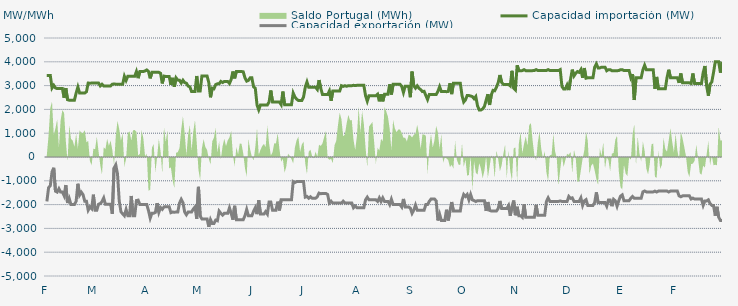
| Category | Capacidad importación (MW) | Capacidad exportación (MW) |
|---|---|---|
| 0 | 3425 | -1866.667 |
| 1900-01-01 | 3425 | -1287.5 |
| 1900-01-02 | 3425 | -1206.25 |
| 1900-01-03 | 2900 | -625 |
| 1900-01-04 | 3012.5 | -454.167 |
| 1900-01-05 | 2900 | -1437.5 |
| 1900-01-06 | 2875 | -1475 |
| 1900-01-07 | 2875 | -1333.333 |
| 1900-01-08 | 2875 | -1475 |
| 1900-01-09 | 2875 | -1475 |
| 1900-01-10 | 2491.667 | -1625 |
| 1900-01-11 | 2895.833 | -1179.167 |
| 1900-01-12 | 2408.333 | -1933.333 |
| 1900-01-13 | 2387.5 | -1745.833 |
| 1900-01-14 | 2387.5 | -2000 |
| 1900-01-15 | 2387.5 | -2000 |
| 1900-01-16 | 2387.5 | -2000 |
| 1900-01-17 | 2687.5 | -1858.333 |
| 1900-01-18 | 2939.583 | -1125 |
| 1900-01-19 | 2687.5 | -1600 |
| 1900-01-20 | 2687.5 | -1479.167 |
| 1900-01-21 | 2687.5 | -1579.167 |
| 1900-01-22 | 2687.5 | -1858.333 |
| 1900-01-23 | 2743.75 | -1858.333 |
| 1900-01-24 | 3108.333 | -2233.333 |
| 1900-01-25 | 3100 | -2102.083 |
| 1900-01-26 | 3108.333 | -2175 |
| 1900-01-27 | 3108.333 | -1584 |
| 1900-01-28 | 3108.333 | -2233.333 |
| 1900-01-29 | 3108.333 | -2233.333 |
| 1900-01-30 | 3108.333 | -1985.417 |
| 1900-01-31 | 2987.5 | -1958.333 |
| 1900-02-01 | 3056.25 | -1872.917 |
| 1900-02-02 | 2987.5 | -1720.833 |
| 1900-02-03 | 2987.5 | -1987.5 |
| 1900-02-04 | 2987.5 | -1987.5 |
| 1900-02-05 | 2987.5 | -1987.5 |
| 1900-02-06 | 2987.5 | -1987.5 |
| 1900-02-07 | 3058.333 | -2387.5 |
| 1900-02-08 | 3070.833 | -464.583 |
| 1900-02-09 | 3058.333 | -331.25 |
| 1900-02-10 | 3058.333 | -706.25 |
| 1900-02-11 | 3058.333 | -1839.583 |
| 1900-02-12 | 3058.333 | -2300 |
| 1900-02-13 | 3058.333 | -2387.5 |
| 1900-02-14 | 3391.667 | -2466.667 |
| 1900-02-15 | 3216.667 | -2204.167 |
| 1900-02-16 | 3391.667 | -2466.667 |
| 1900-02-17 | 3391.667 | -2466.667 |
| 1900-02-18 | 3391.667 | -1637.5 |
| 1900-02-19 | 3391.667 | -2466.667 |
| 1900-02-20 | 3391.667 | -2466.667 |
| 1900-02-21 | 3591.667 | -1829.167 |
| 1900-02-22 | 3313.043 | -1813.043 |
| 1900-02-23 | 3591.667 | -2000 |
| 1900-02-24 | 3591.667 | -2000 |
| 1900-02-25 | 3591.667 | -2000 |
| 1900-02-26 | 3616.667 | -2000 |
| 1900-02-27 | 3658.333 | -2000 |
| 1900-02-28 | 3591.667 | -2252.083 |
| 1900-02-28 | 3304.167 | -2568.75 |
| 1900-03-01 | 3560.417 | -2362.5 |
| 1900-03-02 | 3558.333 | -2362.5 |
| 1900-03-03 | 3558.333 | -2325 |
| 1900-03-04 | 3558.333 | -1937.5 |
| 1900-03-05 | 3558.333 | -2325 |
| 1900-03-06 | 3516.667 | -2125 |
| 1900-03-07 | 3091.667 | -2200 |
| 1900-03-08 | 3400 | -2095.833 |
| 1900-03-09 | 3383.333 | -2087.5 |
| 1900-03-10 | 3383.333 | -2087.5 |
| 1900-03-11 | 3383.333 | -2087.5 |
| 1900-03-12 | 3033.333 | -2339.583 |
| 1900-03-13 | 3325 | -2312.5 |
| 1900-03-14 | 2947.917 | -2320.833 |
| 1900-03-15 | 3325 | -2312.5 |
| 1900-03-16 | 3231.25 | -2312.5 |
| 1900-03-17 | 3225 | -1935.417 |
| 1900-03-18 | 3108.333 | -1779.167 |
| 1900-03-19 | 3225 | -1916.667 |
| 1900-03-20 | 3125 | -2312.5 |
| 1900-03-21 | 3100 | -2427.083 |
| 1900-03-22 | 2979.167 | -2312.5 |
| 1900-03-23 | 2950 | -2312.5 |
| 1900-03-24 | 2750 | -2312.5 |
| 1900-03-25 | 2750 | -2187.5 |
| 1900-03-26 | 2750 | -2100 |
| 1900-03-27 | 3404.167 | -2600 |
| 1900-03-28 | 2772.917 | -1254.167 |
| 1900-03-29 | 2772.917 | -2487.5 |
| 1900-03-30 | 3404.167 | -2600 |
| 1900-03-31 | 3404.167 | -2600 |
| 1900-04-01 | 3404.167 | -2600 |
| 1900-04-02 | 3404.167 | -2600 |
| 1900-04-03 | 3133.333 | -2933.333 |
| 1900-04-04 | 2508.333 | -2633.333 |
| 1900-04-05 | 2891.667 | -2791.667 |
| 1900-04-06 | 2866.667 | -2791.667 |
| 1900-04-07 | 3043.75 | -2652.083 |
| 1900-04-08 | 3075 | -2679.167 |
| 1900-04-09 | 3075 | -2272.917 |
| 1900-04-10 | 3175 | -2366.667 |
| 1900-04-11 | 3129.167 | -2441.667 |
| 1900-04-12 | 3175 | -2366.667 |
| 1900-04-13 | 3175 | -2366.667 |
| 1900-04-14 | 3175 | -2366.667 |
| 1900-04-15 | 3087.5 | -2135.417 |
| 1900-04-16 | 3258.333 | -2366.667 |
| 1900-04-17 | 3591.667 | -2633.333 |
| 1900-04-18 | 3304.167 | -2050 |
| 1900-04-19 | 3591.667 | -2633.333 |
| 1900-04-20 | 3591.667 | -2633.333 |
| 1900-04-21 | 3591.667 | -2633.333 |
| 1900-04-22 | 3591.667 | -2633.333 |
| 1900-04-23 | 3579.167 | -2633.333 |
| 1900-04-24 | 3325 | -2466.667 |
| 1900-04-25 | 3187.5 | -2204.167 |
| 1900-04-26 | 3220.833 | -2466.667 |
| 1900-04-27 | 3325 | -2466.667 |
| 1900-04-28 | 3325 | -2466.667 |
| 1900-04-29 | 2950 | -2279.167 |
| 1900-04-30 | 2887.5 | -2133.333 |
| 1900-05-01 | 2187.5 | -2400 |
| 1900-05-02 | 1981.25 | -1816.667 |
| 1900-05-03 | 2187.5 | -2400 |
| 1900-05-04 | 2187.5 | -2400 |
| 1900-05-05 | 2187.5 | -2400 |
| 1900-05-06 | 2187.5 | -2295.833 |
| 1900-05-07 | 2187.5 | -2400 |
| 1900-05-08 | 2312.5 | -1891.667 |
| 1900-05-09 | 2793.75 | -1891.667 |
| 1900-05-10 | 2312.5 | -2235.417 |
| 1900-05-11 | 2312.5 | -2233.333 |
| 1900-05-12 | 2312.5 | -2233.333 |
| 1900-05-13 | 2312.5 | -1877.083 |
| 1900-05-14 | 2312.5 | -2243.75 |
| 1900-05-15 | 2200 | -1800 |
| 1900-05-16 | 2750 | -1800 |
| 1900-05-17 | 2200 | -1800 |
| 1900-05-18 | 2200 | -1800 |
| 1900-05-19 | 2200 | -1800 |
| 1900-05-20 | 2200 | -1800 |
| 1900-05-21 | 2200 | -1800 |
| 1900-05-22 | 2687.5 | -1033.333 |
| 1900-05-23 | 2522.917 | -1070.833 |
| 1900-05-24 | 2429.167 | -1033.333 |
| 1900-05-25 | 2375 | -1033.333 |
| 1900-05-26 | 2375 | -1033.333 |
| 1900-05-27 | 2375 | -1033.333 |
| 1900-05-28 | 2520.833 | -1033.333 |
| 1900-05-29 | 2929.167 | -1685.417 |
| 1900-05-30 | 3154.167 | -1658.333 |
| 1900-05-31 | 2929.167 | -1733.333 |
| 1900-06-01 | 2929.167 | -1670.833 |
| 1900-06-02 | 2929.167 | -1733.333 |
| 1900-06-03 | 2929.167 | -1733.333 |
| 1900-06-04 | 2929.167 | -1733.333 |
| 1900-06-05 | 2837.5 | -1666.667 |
| 1900-06-06 | 3231.25 | -1516.667 |
| 1900-06-07 | 2887.5 | -1541.667 |
| 1900-06-08 | 2625 | -1533.333 |
| 1900-06-09 | 2625 | -1533.333 |
| 1900-06-10 | 2625 | -1533.333 |
| 1900-06-11 | 2625 | -1575 |
| 1900-06-12 | 2775 | -1933.333 |
| 1900-06-13 | 2362.5 | -1858.333 |
| 1900-06-14 | 2775 | -1933.333 |
| 1900-06-15 | 2775 | -1933.333 |
| 1900-06-16 | 2775 | -1933.333 |
| 1900-06-17 | 2775 | -1933.333 |
| 1900-06-18 | 2775 | -1933.333 |
| 1900-06-19 | 2995.833 | -1933.333 |
| 1900-06-20 | 2964.583 | -1858.333 |
| 1900-06-21 | 2995.833 | -1933.333 |
| 1900-06-22 | 2970.833 | -1933.333 |
| 1900-06-23 | 2995.833 | -1933.333 |
| 1900-06-24 | 2995.833 | -1933.333 |
| 1900-06-25 | 2995.833 | -1933.333 |
| 1900-06-26 | 3012.5 | -2133.333 |
| 1900-06-27 | 3000 | -2058.333 |
| 1900-06-28 | 3012.5 | -2133.333 |
| 1900-06-29 | 3012.5 | -2133.333 |
| 1900-06-30 | 3012.5 | -2133.333 |
| 1900-07-01 | 3012.5 | -2133.333 |
| 1900-07-02 | 3012.5 | -2133.333 |
| 1900-07-03 | 2575 | -1800 |
| 1900-07-04 | 2345.833 | -1687.5 |
| 1900-07-05 | 2575 | -1800 |
| 1900-07-06 | 2575 | -1800 |
| 1900-07-07 | 2575 | -1800 |
| 1900-07-08 | 2575 | -1800 |
| 1900-07-09 | 2575 | -1800 |
| 1900-07-10 | 2637.5 | -1866.667 |
| 1900-07-11 | 2339.583 | -1716.667 |
| 1900-07-12 | 2637.5 | -1866.667 |
| 1900-07-13 | 2339.583 | -1716.667 |
| 1900-07-14 | 2637.5 | -1866.667 |
| 1900-07-15 | 2637.5 | -1866.667 |
| 1900-07-16 | 2637.5 | -1866.667 |
| 1900-07-17 | 3054.167 | -2000 |
| 1900-07-18 | 2627.083 | -1775 |
| 1900-07-19 | 3054.167 | -2000 |
| 1900-07-20 | 3054.167 | -2000 |
| 1900-07-21 | 3054.167 | -2000 |
| 1900-07-22 | 3054.167 | -2000 |
| 1900-07-23 | 3054.167 | -2000 |
| 1900-07-24 | 2970.833 | -2100 |
| 1900-07-25 | 2710.417 | -1762.5 |
| 1900-07-26 | 2970.833 | -2100 |
| 1900-07-27 | 2970.833 | -2100 |
| 1900-07-28 | 2970.833 | -2100 |
| 1900-07-29 | 2512.5 | -2150 |
| 1900-07-30 | 3587.5 | -2366.667 |
| 1900-07-31 | 2991.667 | -2233.333 |
| 1900-08-01 | 2893.75 | -2020.833 |
| 1900-08-02 | 2991.667 | -2233.333 |
| 1900-08-03 | 2891.667 | -2233.333 |
| 1900-08-04 | 2827.083 | -2233.333 |
| 1900-08-05 | 2750 | -2233.333 |
| 1900-08-06 | 2760.417 | -2233.333 |
| 1900-08-07 | 2583.333 | -2000 |
| 1900-08-08 | 2414.583 | -2000 |
| 1900-08-09 | 2629.167 | -1862.5 |
| 1900-08-10 | 2625 | -1766.667 |
| 1900-08-11 | 2625 | -1766.667 |
| 1900-08-12 | 2625 | -1766.667 |
| 1900-08-13 | 2625 | -1841.667 |
| 1900-08-14 | 2754.167 | -2666.667 |
| 1900-08-15 | 2954.167 | -2404.167 |
| 1900-08-16 | 2754.167 | -2666.667 |
| 1900-08-17 | 2754.167 | -2666.667 |
| 1900-08-18 | 2754.167 | -2666.667 |
| 1900-08-19 | 2743.75 | -2216.667 |
| 1900-08-20 | 2754.167 | -2666.667 |
| 1900-08-21 | 3100 | -2266.667 |
| 1900-08-22 | 2641.667 | -1891.667 |
| 1900-08-23 | 3100 | -2266.667 |
| 1900-08-24 | 3100 | -2266.667 |
| 1900-08-25 | 3100 | -2266.667 |
| 1900-08-26 | 3100 | -2266.667 |
| 1900-08-27 | 3100 | -2266.667 |
| 1900-08-28 | 2583.333 | -1800 |
| 1900-08-29 | 2310.417 | -1575 |
| 1900-08-30 | 2400 | -1658.333 |
| 1900-08-31 | 2583.333 | -1575 |
| 1900-09-01 | 2583.333 | -1800 |
| 1900-09-02 | 2562.5 | -1575 |
| 1900-09-03 | 2537.5 | -1800 |
| 1900-09-04 | 2450 | -1833.333 |
| 1900-09-05 | 2541.667 | -1870.833 |
| 1900-09-06 | 2150 | -1833.333 |
| 1900-09-07 | 1975 | -1833.333 |
| 1900-09-08 | 1975 | -1833.333 |
| 1900-09-09 | 2020.833 | -1833.333 |
| 1900-09-10 | 2125 | -1833.333 |
| 1900-09-11 | 2387.5 | -2266.667 |
| 1900-09-12 | 2639.583 | -1891.667 |
| 1900-09-13 | 2187.5 | -2243.75 |
| 1900-09-14 | 2610.417 | -2266.667 |
| 1900-09-15 | 2800 | -2266.667 |
| 1900-09-16 | 2783.333 | -2266.667 |
| 1900-09-17 | 2931.25 | -2266.667 |
| 1900-09-18 | 3125 | -2166.667 |
| 1900-09-19 | 3445.833 | -1847.917 |
| 1900-09-20 | 3137.5 | -2166.667 |
| 1900-09-21 | 3050 | -2166.667 |
| 1900-09-22 | 3050 | -2166.667 |
| 1900-09-23 | 3050 | -2166.667 |
| 1900-09-24 | 3050 | -2041.667 |
| 1900-09-25 | 2987.5 | -2466.667 |
| 1900-09-26 | 3622 | -2080 |
| 1900-09-27 | 2887.5 | -1829.167 |
| 1900-09-28 | 2816.667 | -2445.833 |
| 1900-09-29 | 3854.167 | -2091.667 |
| 1900-09-30 | 3625 | -2466.667 |
| 1900-10-01 | 3625 | -2466.667 |
| 1900-10-02 | 3629.167 | -2533.333 |
| 1900-10-03 | 3670.833 | -1987.5 |
| 1900-10-04 | 3629.167 | -2533.333 |
| 1900-10-05 | 3629.167 | -2533.333 |
| 1900-10-06 | 3629.167 | -2533.333 |
| 1900-10-07 | 3629.167 | -2533.333 |
| 1900-10-08 | 3629.167 | -2533.333 |
| 1900-10-09 | 3633.333 | -2533.333 |
| 1900-10-10 | 3670.833 | -2008.333 |
| 1900-10-11 | 3633.333 | -2450 |
| 1900-10-12 | 3633.333 | -2450 |
| 1900-10-13 | 3633.333 | -2450 |
| 1900-10-14 | 3633.333 | -2450 |
| 1900-10-15 | 3633.333 | -2450 |
| 1900-10-16 | 3633.333 | -1866.667 |
| 1900-10-17 | 3670.833 | -1716.667 |
| 1900-10-18 | 3633.333 | -1866.667 |
| 1900-10-19 | 3633.333 | -1866.667 |
| 1900-10-20 | 3633.333 | -1866.667 |
| 1900-10-21 | 3633.333 | -1866.667 |
| 1900-10-22 | 3633.333 | -1866.667 |
| 1900-10-23 | 3633.333 | -1866.667 |
| 1900-10-24 | 3670.833 | -1845.833 |
| 1900-10-25 | 2966.667 | -1866.667 |
| 1900-10-26 | 2858.333 | -1866.667 |
| 1900-10-27 | 2858.333 | -1866.667 |
| 1900-10-28 | 3025 | -1866.667 |
| 1900-10-29 | 2812.5 | -1658.333 |
| 1900-10-30 | 3262.5 | -1737.5 |
| 1900-10-31 | 3670.833 | -1716.667 |
| 1900-11-01 | 3404.167 | -1866.667 |
| 1900-11-02 | 3512.5 | -1866.667 |
| 1900-11-03 | 3589.583 | -1866.667 |
| 1900-11-04 | 3556.25 | -1866.667 |
| 1900-11-05 | 3670.833 | -1716.667 |
| 1900-11-06 | 3329.167 | -2033.333 |
| 1900-11-07 | 3737.5 | -1845.833 |
| 1900-11-08 | 3310.417 | -1791.667 |
| 1900-11-09 | 3329.167 | -2033.333 |
| 1900-11-10 | 3329.167 | -2033.333 |
| 1900-11-11 | 3329.167 | -2033.333 |
| 1900-11-12 | 3329.167 | -2033.333 |
| 1900-11-13 | 3775 | -1916.667 |
| 1900-11-14 | 3912.5 | -1485.417 |
| 1900-11-15 | 3743.75 | -1916.667 |
| 1900-11-16 | 3743.75 | -1916.667 |
| 1900-11-17 | 3775 | -1916.667 |
| 1900-11-18 | 3775 | -1916.667 |
| 1900-11-19 | 3775 | -1916.667 |
| 1900-11-20 | 3625 | -2066.667 |
| 1900-11-21 | 3670.833 | -1804.167 |
| 1900-11-22 | 3670.833 | -1804.167 |
| 1900-11-23 | 3625 | -2066.667 |
| 1900-11-24 | 3625 | -1779.167 |
| 1900-11-25 | 3625 | -1841.667 |
| 1900-11-26 | 3625 | -2066.667 |
| 1900-11-27 | 3633.333 | -1833.333 |
| 1900-11-28 | 3670.833 | -1645.833 |
| 1900-11-29 | 3670.833 | -1591.667 |
| 1900-11-30 | 3633.333 | -1833.333 |
| 1900-12-01 | 3633.333 | -1833.333 |
| 1900-12-02 | 3633.333 | -1833.333 |
| 1900-12-03 | 3633.333 | -1833.333 |
| 1900-12-04 | 3333.333 | -1733.333 |
| 1900-12-05 | 3483.333 | -1658.333 |
| 1900-12-06 | 2393.75 | -1733.333 |
| 1900-12-07 | 3333.333 | -1733.333 |
| 1900-12-08 | 3333.333 | -1733.333 |
| 1900-12-09 | 3333.333 | -1733.333 |
| 1900-12-10 | 3333.333 | -1733.333 |
| 1900-12-11 | 3662.5 | -1466.667 |
| 1900-12-12 | 3854.167 | -1429.167 |
| 1900-12-13 | 3662.5 | -1466.667 |
| 1900-12-14 | 3662.5 | -1466.667 |
| 1900-12-15 | 3662.5 | -1466.667 |
| 1900-12-16 | 3662.5 | -1466.667 |
| 1900-12-17 | 3662.5 | -1466.667 |
| 1900-12-18 | 2862.5 | -1433.333 |
| 1900-12-19 | 3364.583 | -1470.833 |
| 1900-12-20 | 2862.5 | -1433.333 |
| 1900-12-21 | 2862.5 | -1433.333 |
| 1900-12-22 | 2862.5 | -1433.333 |
| 1900-12-23 | 2862.5 | -1433.333 |
| 1900-12-24 | 2862.5 | -1433.333 |
| 1900-12-25 | 3333.333 | -1433.333 |
| 1900-12-26 | 3666.667 | -1470.833 |
| 1900-12-27 | 3333.333 | -1433.333 |
| 1900-12-28 | 3333.333 | -1433.333 |
| 1900-12-29 | 3333.333 | -1433.333 |
| 1900-12-30 | 3333.333 | -1433.333 |
| 1900-12-31 | 3333.333 | -1433.333 |
| 1901-01-01 | 3116.667 | -1633.333 |
| 1901-01-02 | 3508.333 | -1670.833 |
| 1901-01-03 | 3116.667 | -1633.333 |
| 1901-01-04 | 3116.667 | -1633.333 |
| 1901-01-05 | 3116.667 | -1633.333 |
| 1901-01-06 | 3116.667 | -1633.333 |
| 1901-01-07 | 3116.667 | -1633.333 |
| 1901-01-08 | 3087.5 | -1766.667 |
| 1901-01-09 | 3508.333 | -1729.167 |
| 1901-01-10 | 3087.5 | -1766.667 |
| 1901-01-11 | 3087.5 | -1766.667 |
| 1901-01-12 | 3087.5 | -1766.667 |
| 1901-01-13 | 3087.5 | -1766.667 |
| 1901-01-14 | 3087.5 | -1766.667 |
| 1901-01-15 | 3550 | -2033.333 |
| 1901-01-16 | 3825 | -1845.833 |
| 1901-01-17 | 2987.5 | -1845.833 |
| 1901-01-18 | 2575 | -1800 |
| 1901-01-19 | 3062.5 | -1962.5 |
| 1901-01-20 | 3154.167 | -2033.333 |
| 1901-01-21 | 3550 | -2033.333 |
| 1901-01-22 | 4000 | -2466.667 |
| 1901-01-23 | 4000 | -2091.667 |
| 1901-01-24 | 4000 | -2529.167 |
| 1901-01-25 | 3545.833 | -2666.667 |
| 1901-01-26 | 4000 | -2666.667 |